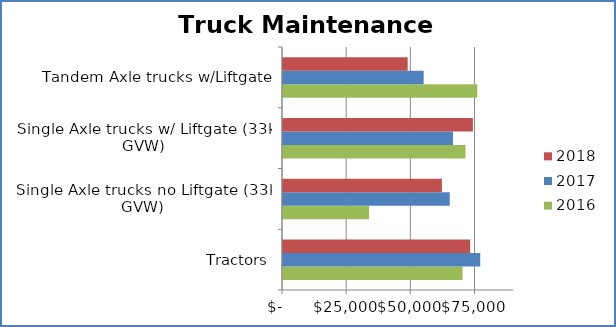
| Category | 2016 | 2017 | 2018 |
|---|---|---|---|
| Tractors | 69957 | 76850 | 72917 |
| Single Axle trucks no Liftgate (33k GVW) | 33535 | 64957 | 61909 |
| Single Axle trucks w/ Liftgate (33k GVW) | 71098 | 66224 | 73982 |
| Tandem Axle trucks w/Liftgate | 75680 | 54809 | 48576 |